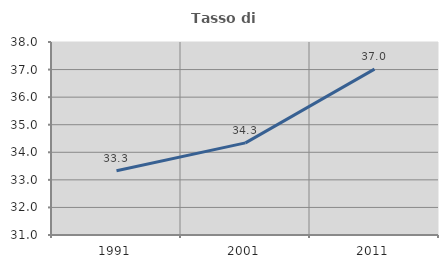
| Category | Tasso di occupazione   |
|---|---|
| 1991.0 | 33.333 |
| 2001.0 | 34.342 |
| 2011.0 | 37.017 |